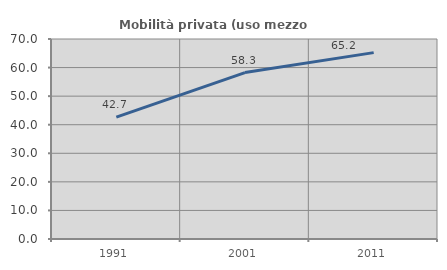
| Category | Mobilità privata (uso mezzo privato) |
|---|---|
| 1991.0 | 42.671 |
| 2001.0 | 58.256 |
| 2011.0 | 65.236 |